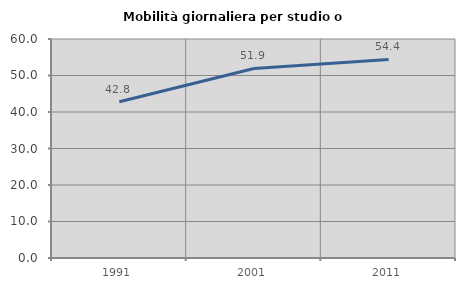
| Category | Mobilità giornaliera per studio o lavoro |
|---|---|
| 1991.0 | 42.82 |
| 2001.0 | 51.929 |
| 2011.0 | 54.406 |